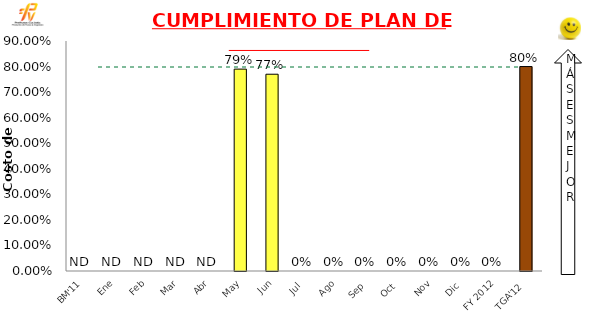
| Category | Mensual |
|---|---|
| BM'11 | 0 |
| Ene | 0 |
| Feb | 0 |
| Mar | 0 |
| Abr | 0 |
| May | 0.79 |
| Jun | 0.77 |
| Jul | 0 |
| Ago | 0 |
| Sep | 0 |
| Oct | 0 |
| Nov | 0 |
| Dic | 0 |
| FY 2012 | 0 |
| TGA'12 | 0.8 |